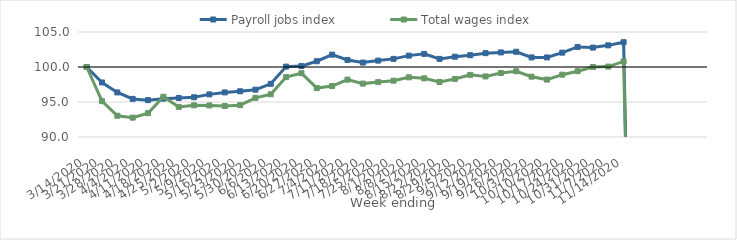
| Category | Payroll jobs index | Total wages index |
|---|---|---|
| 14/03/2020 | 100 | 100 |
| 21/03/2020 | 97.788 | 95.12 |
| 28/03/2020 | 96.367 | 93.035 |
| 04/04/2020 | 95.442 | 92.767 |
| 11/04/2020 | 95.263 | 93.403 |
| 18/04/2020 | 95.481 | 95.751 |
| 25/04/2020 | 95.575 | 94.3 |
| 02/05/2020 | 95.675 | 94.527 |
| 09/05/2020 | 96.089 | 94.512 |
| 16/05/2020 | 96.37 | 94.43 |
| 23/05/2020 | 96.529 | 94.547 |
| 30/05/2020 | 96.763 | 95.596 |
| 06/06/2020 | 97.597 | 96.103 |
| 13/06/2020 | 100.054 | 98.56 |
| 20/06/2020 | 100.128 | 99.11 |
| 27/06/2020 | 100.823 | 96.987 |
| 04/07/2020 | 101.761 | 97.278 |
| 11/07/2020 | 101.008 | 98.197 |
| 18/07/2020 | 100.632 | 97.628 |
| 25/07/2020 | 100.913 | 97.844 |
| 01/08/2020 | 101.161 | 98.047 |
| 08/08/2020 | 101.625 | 98.525 |
| 15/08/2020 | 101.875 | 98.38 |
| 22/08/2020 | 101.159 | 97.854 |
| 29/08/2020 | 101.467 | 98.298 |
| 05/09/2020 | 101.685 | 98.877 |
| 12/09/2020 | 101.98 | 98.656 |
| 19/09/2020 | 102.082 | 99.144 |
| 26/09/2020 | 102.177 | 99.388 |
| 03/10/2020 | 101.367 | 98.617 |
| 10/10/2020 | 101.366 | 98.201 |
| 17/10/2020 | 102.051 | 98.905 |
| 24/10/2020 | 102.863 | 99.401 |
| 31/10/2020 | 102.774 | 100.001 |
| 07/11/2020 | 103.093 | 100.058 |
| 14/11/2020 | 103.544 | 100.793 |